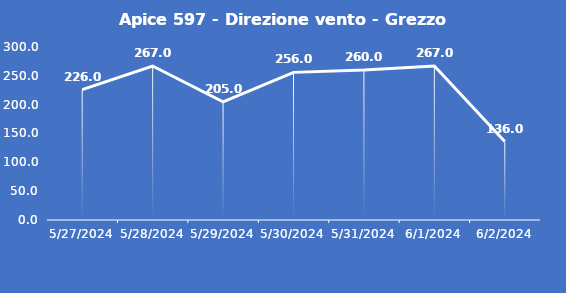
| Category | Apice 597 - Direzione vento - Grezzo (°N) |
|---|---|
| 5/27/24 | 226 |
| 5/28/24 | 267 |
| 5/29/24 | 205 |
| 5/30/24 | 256 |
| 5/31/24 | 260 |
| 6/1/24 | 267 |
| 6/2/24 | 136 |